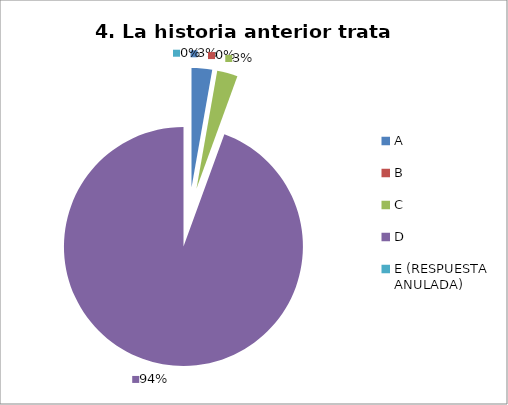
| Category | CANTIDAD DE RESPUESTAS PREGUNTA (4) | PORCENTAJE |
|---|---|---|
| A | 1 | 0.028 |
| B | 0 | 0 |
| C | 1 | 0.028 |
| D | 34 | 0.944 |
| E (RESPUESTA ANULADA) | 0 | 0 |